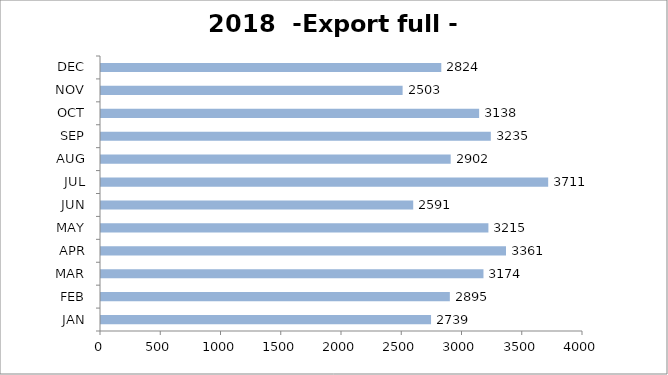
| Category | Export full - 40' |
|---|---|
| JAN | 2739 |
| FEB | 2895 |
| MAR | 3174 |
| APR | 3361 |
| MAY | 3215 |
| JUN | 2591 |
| JUL | 3711 |
| AUG | 2902 |
| SEP | 3235 |
| OCT | 3138 |
| NOV | 2503 |
| DEC | 2824 |